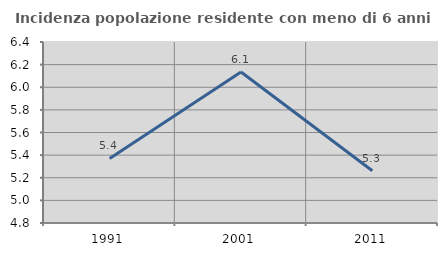
| Category | Incidenza popolazione residente con meno di 6 anni |
|---|---|
| 1991.0 | 5.371 |
| 2001.0 | 6.135 |
| 2011.0 | 5.262 |